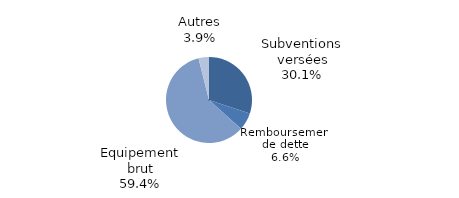
| Category | Series 0 |
|---|---|
| Subventions versées | 0.301 |
| Remboursement de dette | 0.066 |
| Equipement brut | 0.594 |
| Autres | 0.039 |